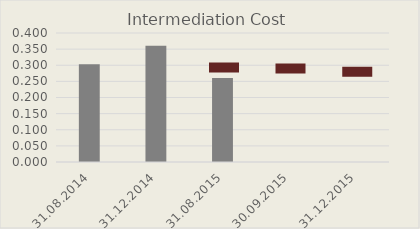
| Category | Intermediation Cost |
|---|---|
| 31.08.2014 | 0.303 |
| 31.12.2014 | 0.36 |
| 31.08.2015 | 0.26 |
| 30.09.2015 | 0 |
| 31.12.2015 | 0 |